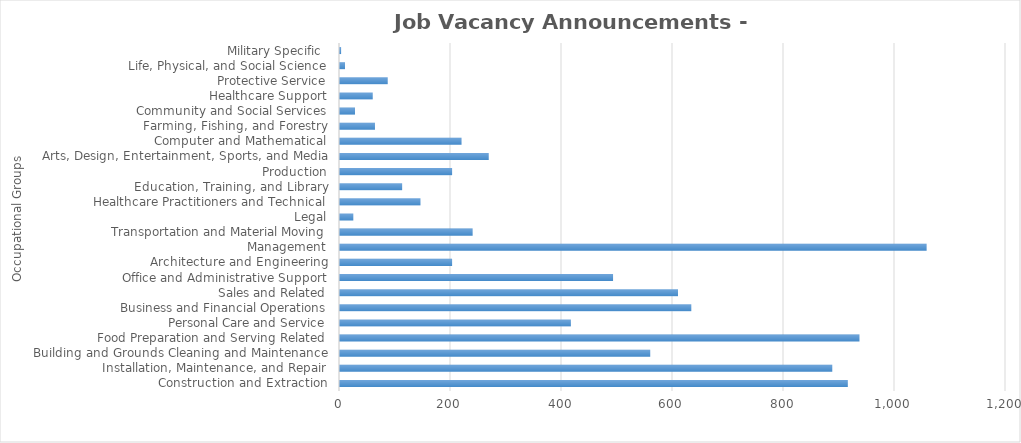
| Category | Total JVAs |
|---|---|
| Construction and Extraction | 915 |
| Installation, Maintenance, and Repair | 887 |
| Building and Grounds Cleaning and Maintenance | 559 |
| Food Preparation and Serving Related | 936 |
| Personal Care and Service | 416 |
| Business and Financial Operations | 633 |
| Sales and Related | 609 |
| Office and Administrative Support | 492 |
| Architecture and Engineering | 202 |
| Management | 1057 |
| Transportation and Material Moving | 239 |
| Legal | 24 |
| Healthcare Practitioners and Technical | 145 |
| Education, Training, and Library | 112 |
| Production | 202 |
| Arts, Design, Entertainment, Sports, and Media | 268 |
| Computer and Mathematical | 219 |
| Farming, Fishing, and Forestry | 63 |
| Community and Social Services | 27 |
| Healthcare Support | 59 |
| Protective Service | 86 |
| Life, Physical, and Social Science | 9 |
| Military Specific  | 2 |